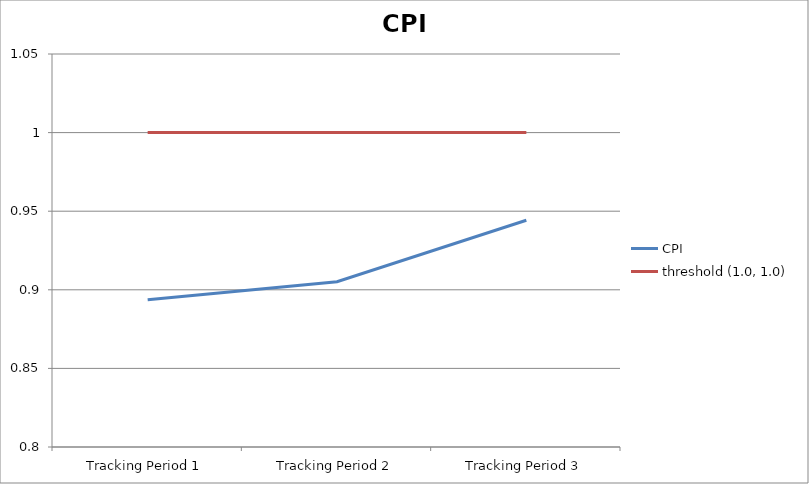
| Category | CPI | threshold (1.0, 1.0) |
|---|---|---|
| Tracking Period 1 | 0.894 | 1 |
| Tracking Period 2 | 0.905 | 1 |
| Tracking Period 3 | 0.944 | 1 |